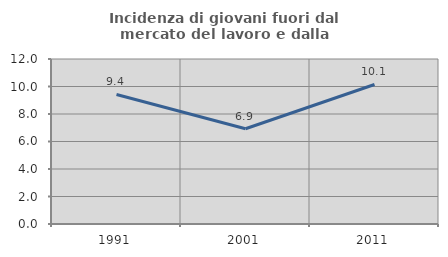
| Category | Incidenza di giovani fuori dal mercato del lavoro e dalla formazione  |
|---|---|
| 1991.0 | 9.422 |
| 2001.0 | 6.927 |
| 2011.0 | 10.148 |